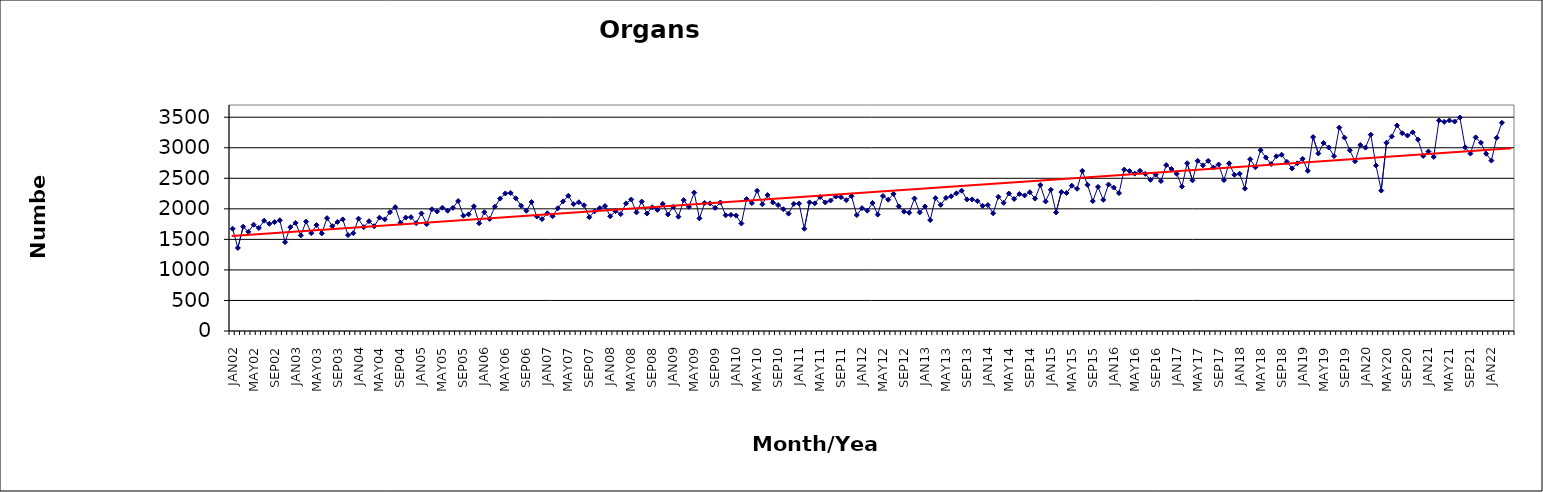
| Category | Series 0 |
|---|---|
| JAN02 | 1675 |
| FEB02 | 1360 |
| MAR02 | 1708 |
| APR02 | 1623 |
| MAY02 | 1740 |
| JUN02 | 1687 |
| JUL02 | 1806 |
| AUG02 | 1755 |
| SEP02 | 1783 |
| OCT02 | 1813 |
| NOV02 | 1455 |
| DEC02 | 1701 |
| JAN03 | 1770 |
| FEB03 | 1565 |
| MAR03 | 1791 |
| APR03 | 1603 |
| MAY03 | 1734 |
| JUN03 | 1598 |
| JUL03 | 1847 |
| AUG03 | 1716 |
| SEP03 | 1785 |
| OCT03 | 1827 |
| NOV03 | 1570 |
| DEC03 | 1602 |
| JAN04 | 1839 |
| FEB04 | 1700 |
| MAR04 | 1797 |
| APR04 | 1715 |
| MAY04 | 1855 |
| JUN04 | 1827 |
| JUL04 | 1945 |
| AUG04 | 2028 |
| SEP04 | 1773 |
| OCT04 | 1857 |
| NOV04 | 1864 |
| DEC04 | 1766 |
| JAN05 | 1925 |
| FEB05 | 1750 |
| MAR05 | 1993 |
| APR05 | 1957 |
| MAY05 | 2018 |
| JUN05 | 1969 |
| JUL05 | 2016 |
| AUG05 | 2127 |
| SEP05 | 1888 |
| OCT05 | 1910 |
| NOV05 | 2042 |
| DEC05 | 1764 |
| JAN06 | 1945 |
| FEB06 | 1834 |
| MAR06 | 2035 |
| APR06 | 2167 |
| MAY06 | 2252 |
| JUN06 | 2261 |
| JUL06 | 2172 |
| AUG06 | 2051 |
| SEP06 | 1969 |
| OCT06 | 2111 |
| NOV06 | 1875 |
| DEC06 | 1832 |
| JAN07 | 1927 |
| FEB07 | 1878 |
| MAR07 | 2009 |
| APR07 | 2122 |
| MAY07 | 2214 |
| JUN07 | 2076 |
| JUL07 | 2108 |
| AUG07 | 2060 |
| SEP07 | 1863 |
| OCT07 | 1959 |
| NOV07 | 2012 |
| DEC07 | 2046 |
| JAN08 | 1878 |
| FEB08 | 1962 |
| MAR08 | 1914 |
| APR08 | 2089 |
| MAY08 | 2153 |
| JUN08 | 1942 |
| JUL08 | 2119 |
| AUG08 | 1923 |
| SEP08 | 2026 |
| OCT08 | 1983 |
| NOV08 | 2082 |
| DEC08 | 1908 |
| JAN09 | 2033 |
| FEB09 | 1871 |
| MAR09 | 2143 |
| APR09 | 2032 |
| MAY09 | 2266 |
| JUN09 | 1844 |
| JUL09 | 2096 |
| AUG09 | 2089 |
| SEP09 | 2016 |
| OCT09 | 2104 |
| NOV09 | 1894 |
| DEC09 | 1901 |
| JAN10 | 1890 |
| FEB10 | 1761 |
| MAR10 | 2160 |
| APR10 | 2094 |
| MAY10 | 2295 |
| JUN10 | 2075 |
| JUL10 | 2226 |
| AUG10 | 2104 |
| SEP10 | 2062 |
| OCT10 | 1994 |
| NOV10 | 1922 |
| DEC10 | 2082 |
| JAN11 | 2085 |
| FEB11 | 1674 |
| MAR11 | 2106 |
| APR11 | 2090 |
| MAY11 | 2194 |
| JUN11 | 2105 |
| JUL11 | 2136 |
| AUG11 | 2202 |
| SEP11 | 2192 |
| OCT11 | 2142 |
| NOV11 | 2207 |
| DEC11 | 1899 |
| JAN12 | 2011 |
| FEB12 | 1970 |
| MAR12 | 2096 |
| APR12 | 1906 |
| MAY12 | 2210 |
| JUN12 | 2150 |
| JUL12 | 2244 |
| AUG12 | 2041 |
| SEP12 | 1954 |
| OCT12 | 1936 |
| NOV12 | 2170 |
| DEC12 | 1941 |
| JAN13 | 2039 |
| FEB13 | 1816 |
| MAR13 | 2175 |
| APR13 | 2065 |
| MAY13 | 2179 |
| JUN13 | 2205 |
| JUL13 | 2254 |
| AUG13 | 2297 |
| SEP13 | 2154 |
| OCT13 | 2154 |
| NOV13 | 2126 |
| DEC13 | 2049 |
| JAN14 | 2061 |
| FEB14 | 1927 |
| MAR14 | 2197 |
| APR14 | 2098 |
| MAY14 | 2251 |
| JUN14 | 2162 |
| JUL14 | 2243 |
| AUG14 | 2220 |
| SEP14 | 2272 |
| OCT14 | 2167 |
| NOV14 | 2391 |
| DEC14 | 2121 |
| JAN15 | 2312 |
| FEB15 | 1942 |
| MAR15 | 2275 |
| APR15 | 2259 |
| MAY15 | 2379 |
| JUN15 | 2328 |
| JUL15 | 2621 |
| AUG15 | 2393 |
| SEP15 | 2127 |
| OCT15 | 2359 |
| NOV15 | 2147 |
| DEC15 | 2398 |
| JAN16 | 2348 |
| FEB16 | 2258 |
| MAR16 | 2642 |
| APR16 | 2619 |
| MAY16 | 2576 |
| JUN16 | 2623 |
| JUL16 | 2573 |
| AUG16 | 2475 |
| SEP16 | 2559 |
| OCT16 | 2455 |
| NOV16 | 2717 |
| DEC16 | 2652 |
| JAN17 | 2574 |
| FEB17 | 2364 |
| MAR17 | 2747 |
| APR17 | 2466 |
| MAY17 | 2786 |
| JUN17 | 2712 |
| JUL17 | 2785 |
| AUG17 | 2676 |
| SEP17 | 2726 |
| OCT17 | 2470 |
| NOV17 | 2745 |
| DEC17 | 2557 |
| JAN18 | 2575 |
| FEB18 | 2331 |
| MAR18 | 2813 |
| APR18 | 2681 |
| MAY18 | 2960 |
| JUN18 | 2839 |
| JUL18 | 2735 |
| AUG18 | 2860 |
| SEP18 | 2886 |
| OCT18 | 2769 |
| NOV18 | 2661 |
| DEC18 | 2745 |
| JAN19 | 2819 |
| FEB19 | 2622 |
| MAR19 | 3175 |
| APR19 | 2906 |
| MAY19 | 3079 |
| JUN19 | 3004 |
| JUL19 | 2863 |
| AUG19 | 3330 |
| SEP19 | 3166 |
| OCT19 | 2958 |
| NOV19 | 2779 |
| DEC19 | 3045 |
| JAN20 | 3002 |
| FEB20 | 3214 |
| MAR20 | 2708 |
| APR20 | 2299 |
| MAY20 | 3082 |
| JUN20 | 3185 |
| JUL20 | 3365 |
| AUG20 | 3238 |
| SEP20 | 3200 |
| OCT20 | 3253 |
| NOV20 | 3133 |
| DEC20 | 2865 |
| JAN21 | 2939 |
| FEB21 | 2850 |
| MAR21 | 3446 |
| APR21 | 3424 |
| MAY21 | 3447 |
| JUN21 | 3429 |
| JUL21 | 3495 |
| AUG21 | 3007 |
| SEP21 | 2905 |
| OCT21 | 3170 |
| NOV21 | 3083 |
| DEC21 | 2902 |
| JAN22 | 2790 |
| FEB22 | 3164 |
| MAR22 | 3409 |